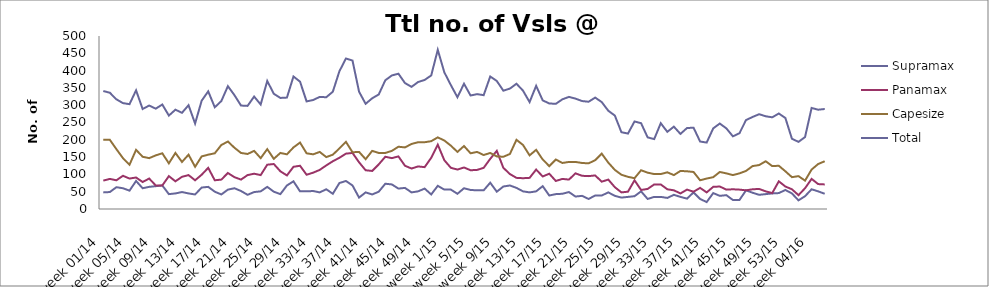
| Category | Supramax | Panamax | Capesize | Total |
|---|---|---|---|---|
| week 01/14 | 48 | 82 | 200 | 341 |
| week 02/14 | 49 | 87 | 200 | 336 |
| week 03/14 | 63 | 83 | 173 | 317 |
| week 04/14 | 60 | 96 | 147 | 306 |
| week 05/14 | 53 | 88 | 128 | 303 |
| week 06/14 | 81 | 91 | 171 | 343 |
| week 07/14 | 60 | 78 | 151 | 289 |
| week 08/14 | 64 | 88 | 147 | 299 |
| week 09/14 | 66 | 68 | 155 | 290 |
| week 10/14 | 68 | 68 | 161 | 302 |
| week 11/14 | 43 | 95 | 132 | 270 |
| week 12/14 | 45 | 80 | 162 | 287 |
| week 13/14 | 49 | 93 | 136 | 278 |
| week 14/14 | 45 | 98 | 157 | 300 |
| week 15/14 | 42 | 83 | 122 | 247 |
| week 16/14 | 62 | 99 | 152 | 313 |
| week 17/14 | 64 | 119 | 157 | 340 |
| week 18/14 | 50 | 83 | 161 | 294 |
| week 19/14 | 42 | 85 | 185 | 312 |
| week 20/14 | 56 | 104 | 195 | 355 |
| week 21/14 | 60 | 92 | 177 | 329 |
| week 22/14 | 52 | 85 | 162 | 299 |
| week 23/14 | 41 | 98 | 159 | 298 |
| week 24/14 | 49 | 102 | 168 | 325 |
| week 25/14 | 51 | 98 | 147 | 302 |
| week 26/14 | 64 | 128 | 173 | 370 |
| week 27/14 | 50 | 130 | 145 | 333 |
| week 28/14 | 43 | 109 | 162 | 321 |
| week 29/14 | 68 | 97 | 158 | 322 |
| week 30/14 | 80 | 122 | 178 | 383 |
| week 31/14 | 51 | 125 | 192 | 368 |
| week 32/14 | 51 | 99 | 161 | 311 |
| week 33/14 | 52 | 105 | 158 | 315 |
| week 34/14 | 48 | 113 | 165 | 324 |
| week 35/14 | 57 | 126 | 150 | 323 |
| week 36/14 | 44 | 138 | 157 | 339 |
| week 37/14 | 75 | 148 | 175 | 398 |
| week 38/14 | 81 | 160 | 194 | 435 |
| week 39/14 | 68 | 162 | 164 | 429 |
| week 40/14 | 33 | 135 | 165 | 339 |
| week 41/14 | 48 | 112 | 144 | 304 |
| week 42/14 | 42 | 110 | 168 | 320 |
| week 43/14 | 50 | 129 | 162 | 331 |
| week 44/14 | 73 | 151 | 162 | 372 |
| week 45/14 | 71 | 147 | 168 | 386 |
| week 46/14 | 59 | 152 | 180 | 391 |
| week 47/14 | 61 | 125 | 178 | 364 |
| week 48/14 | 48 | 117 | 188 | 353 |
| week 49/14 | 51 | 123 | 193 | 367 |
| week 50/14 | 59 | 121 | 193 | 373 |
| week 51/14 | 42 | 148 | 196 | 386 |
| week 52/14 | 67 | 186 | 207 | 460 |
| week 1/15 | 56 | 141 | 198 | 395 |
| week 2/15 | 56 | 119 | 183 | 358 |
| week 3/15 | 44 | 114 | 165 | 323 |
| week 4/15 | 60 | 120 | 182 | 362 |
| week 5/15 | 55 | 112 | 161 | 328 |
| week 6/15 | 54 | 113 | 165 | 332 |
| week 7/15 | 54 | 119 | 156 | 329 |
| week 8/15 | 76 | 145 | 162 | 383 |
| week 9/15 | 50 | 168 | 152 | 370 |
| week 10/15 | 65 | 119 | 151 | 342 |
| week 11/15 | 68 | 101 | 159 | 348 |
| week 12/15 | 61 | 90 | 200 | 362 |
| week 13/15 | 51 | 89 | 185 | 342 |
| week 14/15 | 48 | 90 | 155 | 309 |
| week 15/15 | 51 | 114 | 171 | 356 |
| week 16/15 | 66 | 94 | 143 | 314 |
| week 17/15 | 39 | 102 | 124 | 305 |
| week 18/15 | 43 | 81 | 143 | 304 |
| week 19/15 | 44 | 87 | 133 | 317 |
| week 20/15 | 49 | 85 | 136 | 324 |
| week 21/15 | 36 | 103 | 136 | 319 |
| week 22/15 | 38 | 96 | 133 | 312 |
| week 23/15 | 29 | 95 | 132 | 310 |
| week 24/15 | 39 | 97 | 141 | 322 |
| week 25/15 | 39 | 79 | 160 | 309 |
| week 26/15 | 48 | 85 | 134 | 284 |
| week 27/15 | 38 | 63 | 113 | 270 |
| week 28/15 | 33 | 48 | 99 | 222 |
| week 29/15 | 35 | 50 | 93 | 218 |
| week 30/15 | 37 | 83 | 89 | 253 |
| week 31/15 | 51 | 55 | 112 | 248 |
| week 32/15 | 29 | 58 | 105 | 207 |
| week 33/15 | 35 | 71 | 101 | 202 |
| week 34/15 | 35 | 71 | 101 | 248 |
| week 35/15 | 32 | 57 | 106 | 223 |
| week 36/15 | 41 | 54 | 98 | 238 |
| week 37/15 | 35 | 45 | 110 | 217 |
| week 38/15 | 30 | 56 | 109 | 234 |
| week 39/15 | 48 | 50 | 107 | 235 |
| week 40/15 | 29 | 61 | 83 | 195 |
| week 41/15 | 20 | 48 | 88 | 192 |
| week 42/15 | 46 | 64 | 92 | 233 |
| week 43/15 | 38 | 65 | 107 | 247 |
| week 44/15 | 40 | 56 | 103 | 233 |
| week 45/15 | 26 | 57 | 98 | 210 |
| week 46/15 | 26 | 56 | 103 | 219 |
| week 47/15 | 54 | 54 | 110 | 257 |
| week 48/15 | 47 | 57 | 124 | 266 |
| week 49/15 | 41 | 58 | 127 | 274 |
| week 50/15 | 43 | 51 | 138 | 268 |
| week 51/15 | 45 | 46 | 124 | 265 |
| week 52/15 | 46 | 80 | 125 | 276 |
| week 53/15 | 55 | 65 | 109 | 263 |
| week 01/16 | 45 | 57 | 92 | 203 |
| week 02/16 | 25 | 40 | 95 | 194 |
| week 03/16 | 37 | 60 | 82 | 208 |
| week 04/16 | 57 | 87 | 114 | 292 |
| week 05/16 | 51 | 72 | 130 | 287 |
| week 06/16 | 44 | 71 | 138 | 289 |